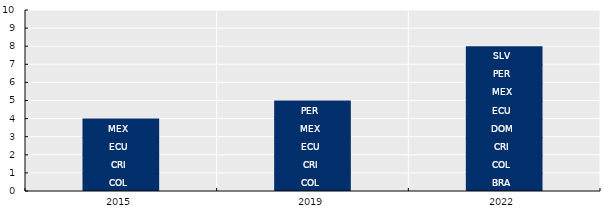
| Category | ARG | BRA | CHL | COL | CRI | DOM | ECU | MEX | PER | PRY | SLV |
|---|---|---|---|---|---|---|---|---|---|---|---|
| 2015.0 | 0 | 0 | 0 | 1 | 1 | 0 | 1 | 1 | 0 | 0 | 0 |
| 2019.0 | 0 | 0 | 0 | 1 | 1 | 0 | 1 | 1 | 1 | 0 | 0 |
| 2022.0 | 0 | 1 | 0 | 1 | 1 | 1 | 1 | 1 | 1 | 0 | 1 |